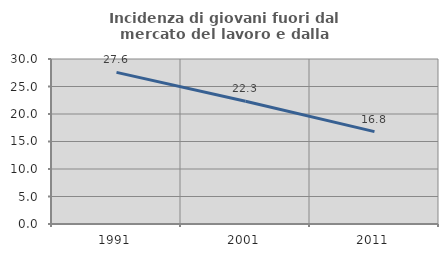
| Category | Incidenza di giovani fuori dal mercato del lavoro e dalla formazione  |
|---|---|
| 1991.0 | 27.564 |
| 2001.0 | 22.321 |
| 2011.0 | 16.802 |